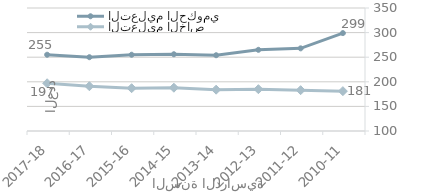
| Category | التعليم الحكومي | التعليم الخاص |
|---|---|---|
| 2010-11 | 299 | 181 |
| 2011-12 | 268 | 183 |
| 2012-13 | 265 | 185 |
| 2013-14 | 254 | 184 |
| 2014-15 | 256 | 188 |
| 2015-16 | 255 | 187 |
| 2016-17 | 250 | 191 |
| 2017-18 | 255 | 197 |